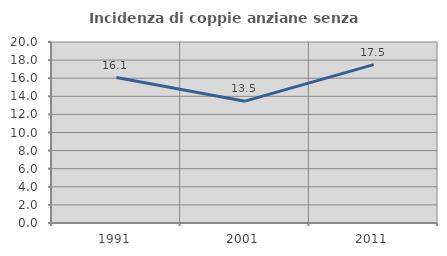
| Category | Incidenza di coppie anziane senza figli  |
|---|---|
| 1991.0 | 16.071 |
| 2001.0 | 13.462 |
| 2011.0 | 17.5 |